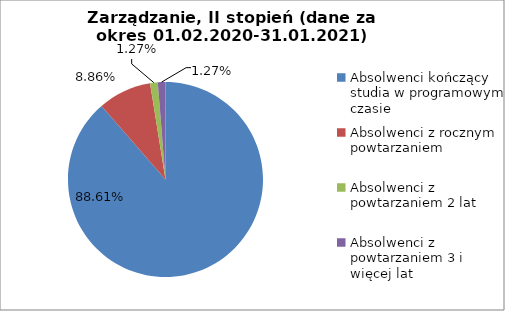
| Category | Series 0 |
|---|---|
| Absolwenci kończący studia w programowym czasie | 88.608 |
| Absolwenci z rocznym powtarzaniem | 8.861 |
| Absolwenci z powtarzaniem 2 lat | 1.266 |
| Absolwenci z powtarzaniem 3 i więcej lat | 1.266 |